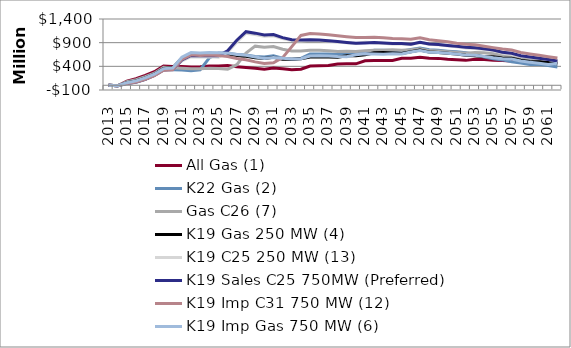
| Category | All Gas (1) | K22 Gas (2) | Gas C26 (7) | K19 Gas 250 MW (4) | K19 C25 250 MW (13) | K19 Sales C25 750MW (Preferred) | K19 Imp C31 750 MW (12) | K19 Imp Gas 750 MW (6) |
|---|---|---|---|---|---|---|---|---|
| 2013.0 | 0 | 0 | 0 | 0 | 0 | 0 | 0 | 0 |
| 2014.0 | -11 | -10 | -10 | -10 | -11 | -10 | -10 | -10 |
| 2015.0 | 85 | 31 | 74 | 54 | 38 | 39 | 39 | 55 |
| 2016.0 | 138 | 64 | 117 | 92 | 65 | 67 | 67 | 92 |
| 2017.0 | 207 | 124 | 180 | 155 | 125 | 125 | 127 | 155 |
| 2018.0 | 286 | 221 | 254 | 234 | 206 | 206 | 201 | 233 |
| 2019.0 | 406 | 338 | 379 | 353 | 321 | 322 | 317 | 352 |
| 2020.0 | 398 | 328 | 368 | 368 | 330 | 331 | 326 | 365 |
| 2021.0 | 398 | 323 | 358 | 570 | 516 | 537 | 547 | 593 |
| 2022.0 | 385 | 308 | 347 | 655 | 604 | 631 | 642 | 690 |
| 2023.0 | 393 | 328 | 350 | 645 | 595 | 623 | 627 | 682 |
| 2024.0 | 408 | 579 | 360 | 656 | 601 | 631 | 638 | 691 |
| 2025.0 | 406 | 683 | 355 | 665 | 594 | 625 | 628 | 688 |
| 2026.0 | 415 | 677 | 341 | 658 | 695 | 730 | 608 | 679 |
| 2027.0 | 392 | 650 | 435 | 628 | 915 | 951 | 566 | 648 |
| 2028.0 | 376 | 637 | 680 | 612 | 1101 | 1132 | 537 | 633 |
| 2029.0 | 360 | 608 | 826 | 579 | 1072 | 1101 | 494 | 599 |
| 2030.0 | 338 | 596 | 802 | 567 | 1034 | 1063 | 458 | 565 |
| 2031.0 | 364 | 622 | 818 | 592 | 1047 | 1071 | 474 | 585 |
| 2032.0 | 351 | 573 | 762 | 549 | 987 | 1007 | 583 | 569 |
| 2033.0 | 328 | 550 | 725 | 548 | 944 | 961 | 816 | 553 |
| 2034.0 | 338 | 568 | 724 | 558 | 937 | 955 | 1053 | 559 |
| 2035.0 | 406 | 662 | 740 | 599 | 949 | 960 | 1091 | 619 |
| 2036.0 | 412 | 662 | 739 | 598 | 945 | 956 | 1083 | 621 |
| 2037.0 | 416 | 659 | 728 | 596 | 934 | 942 | 1066 | 617 |
| 2038.0 | 451 | 648 | 716 | 591 | 916 | 923 | 1047 | 607 |
| 2039.0 | 454 | 680 | 720 | 624 | 897 | 903 | 1027 | 603 |
| 2040.0 | 452 | 679 | 714 | 626 | 883 | 887 | 1007 | 643 |
| 2041.0 | 516 | 695 | 727 | 643 | 907 | 895 | 1010 | 664 |
| 2042.0 | 524 | 740 | 741 | 688 | 898 | 903 | 1016 | 658 |
| 2043.0 | 524 | 742 | 738 | 690 | 886 | 895 | 1004 | 653 |
| 2044.0 | 524 | 734 | 749 | 683 | 874 | 881 | 987 | 665 |
| 2045.0 | 570 | 721 | 741 | 672 | 873 | 881 | 983 | 661 |
| 2046.0 | 571 | 758 | 751 | 708 | 860 | 869 | 971 | 704 |
| 2047.0 | 593 | 789 | 769 | 742 | 902 | 908 | 1003 | 735 |
| 2048.0 | 571 | 750 | 732 | 705 | 868 | 874 | 961 | 699 |
| 2049.0 | 568 | 738 | 722 | 694 | 854 | 859 | 940 | 690 |
| 2050.0 | 550 | 721 | 708 | 677 | 836 | 839 | 921 | 676 |
| 2051.0 | 538 | 706 | 693 | 658 | 811 | 822 | 889 | 662 |
| 2052.0 | 526 | 688 | 674 | 633 | 786 | 802 | 865 | 637 |
| 2053.0 | 547 | 656 | 690 | 622 | 778 | 794 | 855 | 633 |
| 2054.0 | 545 | 598 | 686 | 600 | 758 | 770 | 825 | 608 |
| 2055.0 | 527 | 560 | 667 | 602 | 736 | 743 | 795 | 582 |
| 2056.0 | 525 | 536 | 637 | 578 | 675 | 696 | 764 | 561 |
| 2057.0 | 510 | 498 | 610 | 570 | 651 | 677 | 743 | 553 |
| 2058.0 | 486 | 471 | 584 | 527 | 612 | 625 | 693 | 512 |
| 2059.0 | 482 | 439 | 556 | 501 | 592 | 597 | 661 | 486 |
| 2060.0 | 467 | 438 | 531 | 496 | 573 | 573 | 632 | 464 |
| 2061.0 | 457 | 419 | 506 | 481 | 543 | 543 | 604 | 438 |
| 2062.0 | 491 | 384 | 481 | 456 | 509 | 511 | 577 | 465 |